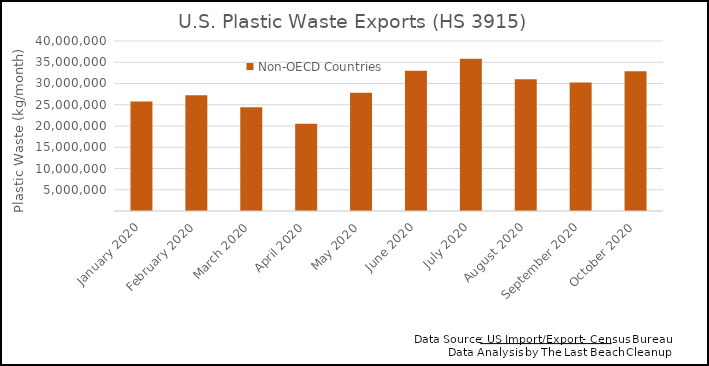
| Category | Non-OECD Countries |
|---|---|
| January 2020 | 25783161 |
| February 2020 | 27250856 |
| March 2020 | 24390271 |
| April 2020 | 20524268 |
| May 2020 | 27802557 |
| June 2020 | 32976114 |
| July 2020 | 35834981 |
| August 2020 | 31005120 |
| September 2020 | 30253357 |
| October 2020 | 32854889 |